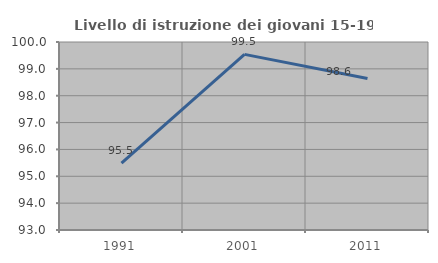
| Category | Livello di istruzione dei giovani 15-19 anni |
|---|---|
| 1991.0 | 95.493 |
| 2001.0 | 99.539 |
| 2011.0 | 98.643 |